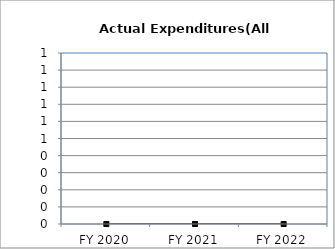
| Category | Actual Expenditures(All Funds) |
|---|---|
| FY 2020 | 0 |
| FY 2021 | 0 |
| FY 2022 | 0 |